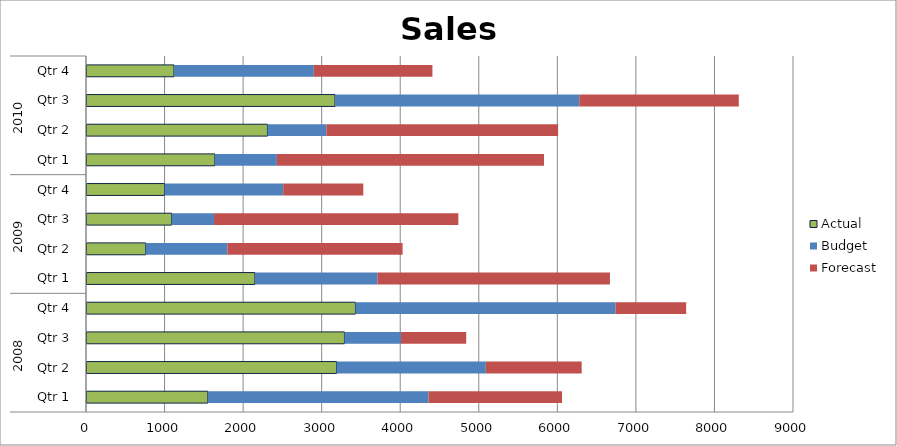
| Category | Actual | Budget | Forecast |
|---|---|---|---|
| 0 | 1550 | 2810 | 1700 |
| 1 | 3190 | 1900 | 1220 |
| 2 | 3290 | 720 | 830 |
| 3 | 3430 | 3310 | 900 |
| 4 | 2150 | 1560 | 2960 |
| 5 | 760 | 1040 | 2230 |
| 6 | 1090 | 540 | 3110 |
| 7 | 1000 | 1510 | 1020 |
| 8 | 1640 | 790 | 3400 |
| 9 | 2310 | 750 | 2950 |
| 10 | 3170 | 3110 | 2030 |
| 11 | 1120 | 1780 | 1510 |